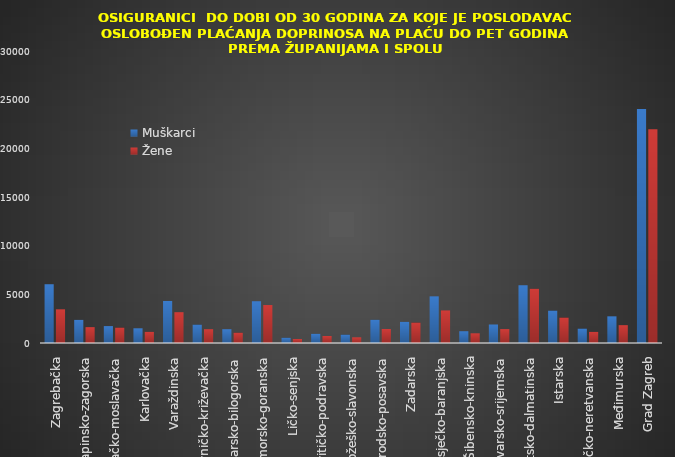
| Category | Muškarci | Žene |
|---|---|---|
| Zagrebačka | 6038 | 3461 |
| Krapinsko-zagorska | 2377 | 1629 |
| Sisačko-moslavačka | 1737 | 1586 |
| Karlovačka | 1511 | 1146 |
| Varaždinska | 4321 | 3166 |
| Koprivničko-križevačka | 1893 | 1420 |
| Bjelovarsko-bilogorska | 1420 | 1061 |
| Primorsko-goranska | 4291 | 3901 |
| Ličko-senjska | 542 | 409 |
| Virovitičko-podravska | 946 | 721 |
| Požeško-slavonska | 861 | 584 |
| Brodsko-posavska | 2389 | 1439 |
| Zadarska | 2177 | 2104 |
| Osječko-baranjska | 4794 | 3347 |
| Šibensko-kninska | 1210 | 996 |
| Vukovarsko-srijemska | 1901 | 1431 |
| Splitsko-dalmatinska | 5934 | 5574 |
| Istarska | 3335 | 2617 |
| Dubrovačko-neretvanska | 1484 | 1143 |
| Međimurska | 2740 | 1833 |
| Grad Zagreb | 24034 | 21969 |